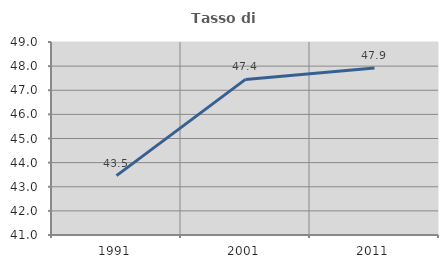
| Category | Tasso di occupazione   |
|---|---|
| 1991.0 | 43.46 |
| 2001.0 | 47.449 |
| 2011.0 | 47.922 |